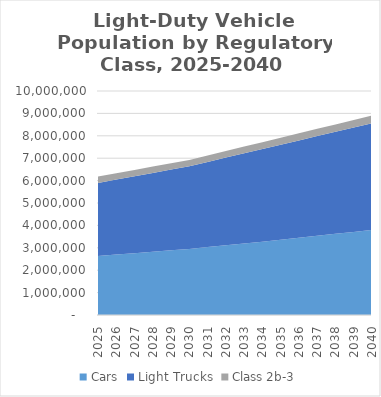
| Category | Cars | Light Trucks | Class 2b-3 |
|---|---|---|---|
| 2025.0 | 2632260.01 | 3265327.694 | 281150.703 |
| 2026.0 | 2695890 | 3350460 | 280900 |
| 2027.0 | 2759510 | 3435580 | 280650 |
| 2028.0 | 2823140 | 3520710 | 280400 |
| 2029.0 | 2886770 | 3605840 | 280150 |
| 2030.0 | 2950394.052 | 3690967.954 | 279898.701 |
| 2031.0 | 3031210 | 3802600 | 286310 |
| 2032.0 | 3112030 | 3914230 | 292720 |
| 2033.0 | 3192850 | 4025860 | 299130 |
| 2034.0 | 3273660 | 4137490 | 305540 |
| 2035.0 | 3354481.451 | 4249122.457 | 311950.336 |
| 2036.0 | 3443590 | 4351490 | 318280 |
| 2037.0 | 3532700 | 4453850 | 324610 |
| 2038.0 | 3621810 | 4556220 | 330940 |
| 2039.0 | 3710920 | 4658580 | 337270 |
| 2040.0 | 3800035.475 | 4760943.802 | 343601.992 |